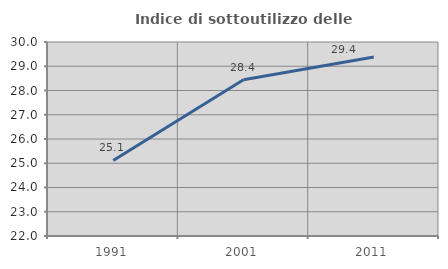
| Category | Indice di sottoutilizzo delle abitazioni  |
|---|---|
| 1991.0 | 25.114 |
| 2001.0 | 28.439 |
| 2011.0 | 29.385 |